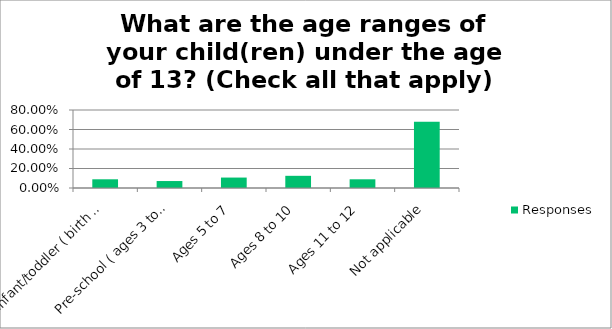
| Category | Responses |
|---|---|
| Infant/toddler ( birth to 2 years) | 0.089 |
| Pre-school ( ages 3 to 4) | 0.071 |
| Ages 5 to 7 | 0.107 |
| Ages 8 to 10 | 0.125 |
| Ages 11 to 12 | 0.089 |
| Not applicable | 0.679 |